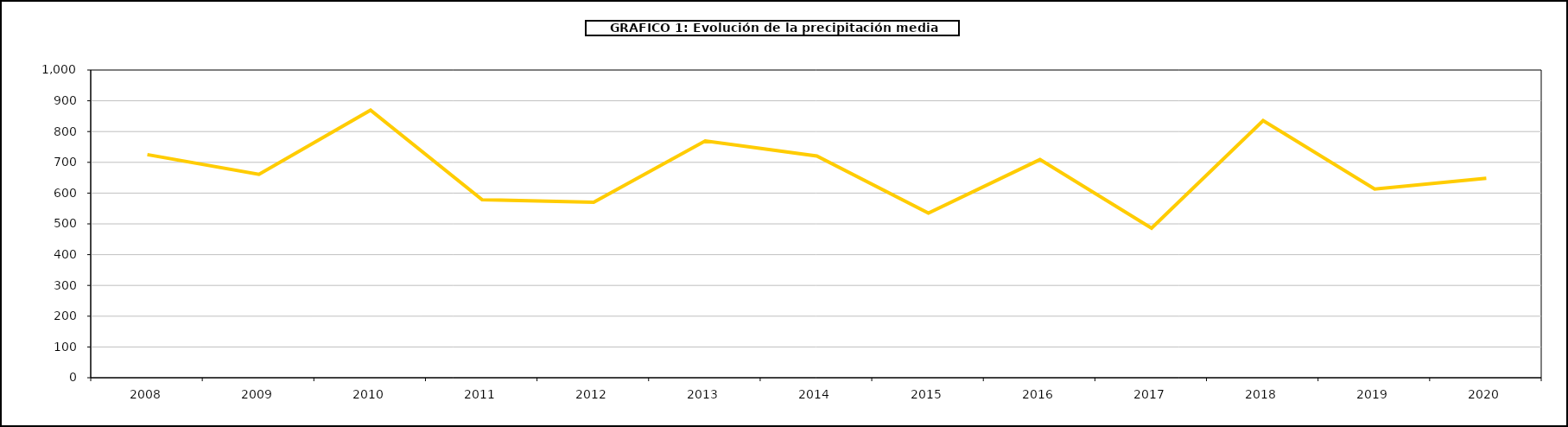
| Category | Series 0 |
|---|---|
| 2008.0 | 725 |
| 2009.0 | 661 |
| 2010.0 | 869.377 |
| 2011.0 | 578.444 |
| 2012.0 | 570.087 |
| 2013.0 | 769.551 |
| 2014.0 | 720.348 |
| 2015.0 | 535.081 |
| 2016.0 | 709 |
| 2017.0 | 486 |
| 2018.0 | 835.465 |
| 2019.0 | 613.3 |
| 2020.0 | 647.9 |